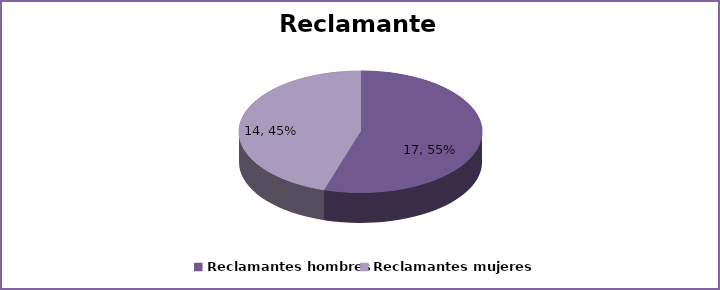
| Category | Series 0 |
|---|---|
| Reclamantes hombres | 17 |
| Reclamantes mujeres | 14 |